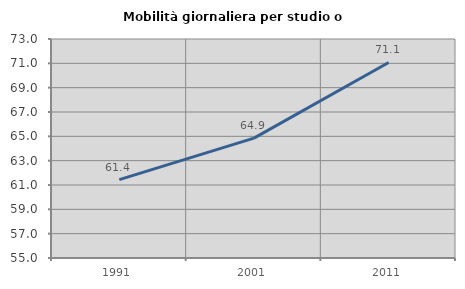
| Category | Mobilità giornaliera per studio o lavoro |
|---|---|
| 1991.0 | 61.438 |
| 2001.0 | 64.856 |
| 2011.0 | 71.069 |